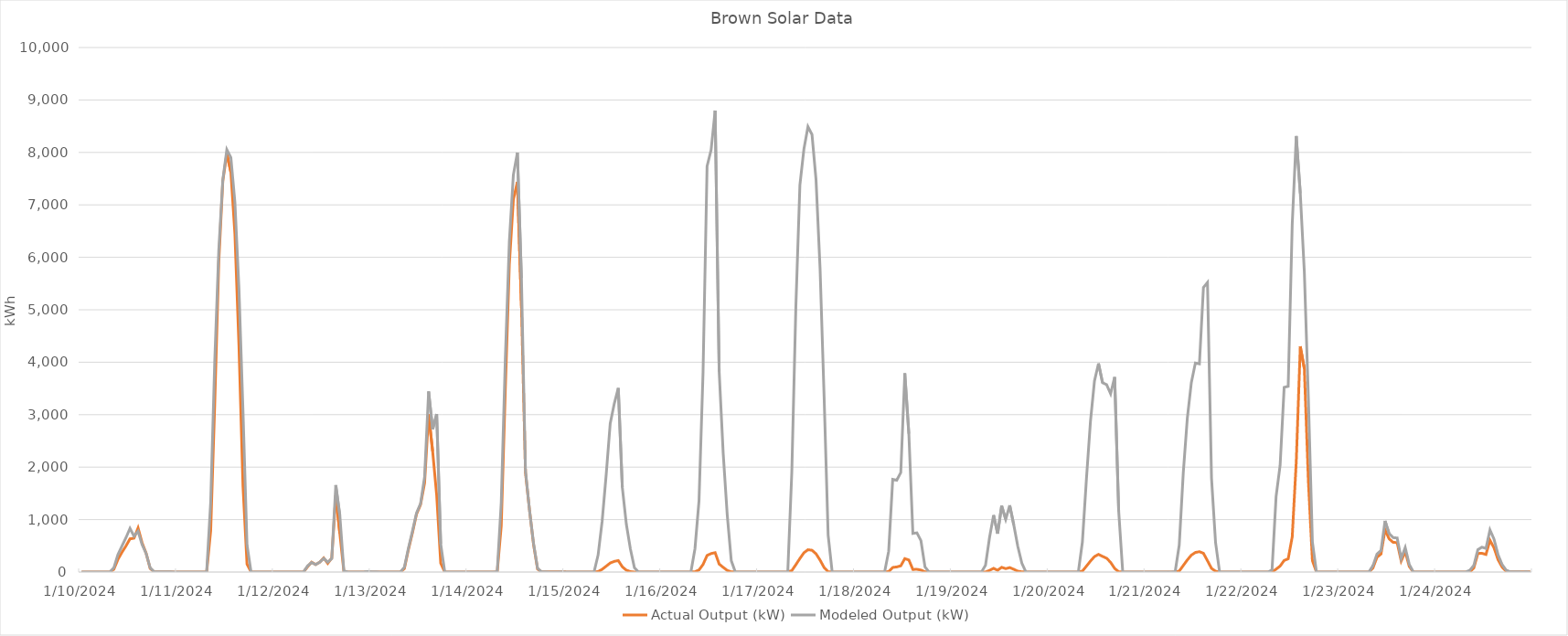
| Category | Actual Output (kW) | Modeled Output (kW) |
|---|---|---|
| 1/10/24 | 1.117 | 1.117 |
| 1/10/24 | 1.09 | 1.09 |
| 1/10/24 | 1.063 | 1.063 |
| 1/10/24 | 1.036 | 1.036 |
| 1/10/24 | 1.009 | 1.009 |
| 1/10/24 | 0.982 | 0.982 |
| 1/10/24 | 0.955 | 0.955 |
| 1/10/24 | 0.928 | 0.928 |
| 1/10/24 | 51.769 | 81.264 |
| 1/10/24 | 237.368 | 328.672 |
| 1/10/24 | 373.502 | 496.039 |
| 1/10/24 | 496.293 | 653.382 |
| 1/10/24 | 632.384 | 832.206 |
| 1/10/24 | 645.488 | 684.64 |
| 1/10/24 | 839.412 | 778.099 |
| 1/10/24 | 557.953 | 524.02 |
| 1/10/24 | 355.719 | 352.922 |
| 1/10/24 | 66.972 | 81.865 |
| 1/10/24 | 2.694 | 2.694 |
| 1/10/24 | 2.578 | 2.578 |
| 1/10/24 | 2.461 | 2.461 |
| 1/10/24 | 2.345 | 2.345 |
| 1/10/24 | 2.228 | 2.228 |
| 1/10/24 | 2.112 | 2.112 |
| 1/11/24 | 1.996 | 1.996 |
| 1/11/24 | 1.879 | 1.879 |
| 1/11/24 | 1.763 | 1.763 |
| 1/11/24 | 1.646 | 1.646 |
| 1/11/24 | 1.53 | 1.53 |
| 1/11/24 | 1.413 | 1.413 |
| 1/11/24 | 1.297 | 1.297 |
| 1/11/24 | 3.145 | 2.201 |
| 1/11/24 | 789.109 | 1336.099 |
| 1/11/24 | 3197.18 | 4009.771 |
| 1/11/24 | 5903.223 | 6131.303 |
| 1/11/24 | 7453.196 | 7477.424 |
| 1/11/24 | 7979.953 | 8054.438 |
| 1/11/24 | 7621.726 | 7903.486 |
| 1/11/24 | 6444.588 | 7047.981 |
| 1/11/24 | 4318.28 | 5406.942 |
| 1/11/24 | 1637.657 | 3072.164 |
| 1/11/24 | 151.223 | 519.311 |
| 1/11/24 | 1.551 | 1.551 |
| 1/11/24 | 1.484 | 1.484 |
| 1/11/24 | 1.417 | 1.417 |
| 1/11/24 | 1.349 | 1.349 |
| 1/11/24 | 1.282 | 1.282 |
| 1/11/24 | 1.215 | 1.215 |
| 1/12/24 | 1.148 | 1.148 |
| 1/12/24 | 1.081 | 1.081 |
| 1/12/24 | 1.014 | 1.014 |
| 1/12/24 | 0.947 | 0.947 |
| 1/12/24 | 0.879 | 0.879 |
| 1/12/24 | 0.812 | 0.812 |
| 1/12/24 | 0.745 | 0.745 |
| 1/12/24 | 0.751 | 0.751 |
| 1/12/24 | 99.489 | 115.597 |
| 1/12/24 | 187.894 | 181.935 |
| 1/12/24 | 141.531 | 143.139 |
| 1/12/24 | 185.418 | 187.278 |
| 1/12/24 | 267.803 | 258.576 |
| 1/12/24 | 164.709 | 188.502 |
| 1/12/24 | 266.594 | 256.698 |
| 1/12/24 | 1463.703 | 1658.074 |
| 1/12/24 | 736.057 | 1080.629 |
| 1/12/24 | 11.817 | 22.408 |
| 1/12/24 | 1.42 | 1.42 |
| 1/12/24 | 1.331 | 1.331 |
| 1/12/24 | 1.241 | 1.241 |
| 1/12/24 | 1.152 | 1.152 |
| 1/12/24 | 1.063 | 2.999 |
| 1/12/24 | 0.974 | 6.732 |
| 1/13/24 | 0.884 | 2.244 |
| 1/13/24 | 0.795 | 3.715 |
| 1/13/24 | 0.706 | 1.595 |
| 1/13/24 | 0.617 | 0.303 |
| 1/13/24 | 0.527 | 0.743 |
| 1/13/24 | 0.438 | 0.438 |
| 1/13/24 | 0.349 | 0.349 |
| 1/13/24 | 0.293 | 0.132 |
| 1/13/24 | 68.04 | 93.998 |
| 1/13/24 | 430.234 | 457.523 |
| 1/13/24 | 748.734 | 782.355 |
| 1/13/24 | 1101.31 | 1125.167 |
| 1/13/24 | 1283.855 | 1304.01 |
| 1/13/24 | 1699.188 | 1813.805 |
| 1/13/24 | 3004.897 | 3442.887 |
| 1/13/24 | 2300.74 | 2720.902 |
| 1/13/24 | 1461.256 | 3012.336 |
| 1/13/24 | 167.529 | 534.087 |
| 1/13/24 | 0.818 | 0.818 |
| 1/13/24 | 0.785 | 0.785 |
| 1/13/24 | 0.779 | 0.779 |
| 1/13/24 | 0.772 | 0.772 |
| 1/13/24 | 0.766 | 0.766 |
| 1/13/24 | 0.759 | 0.759 |
| 1/14/24 | 0.753 | 0.753 |
| 1/14/24 | 0.746 | 0.746 |
| 1/14/24 | 0.74 | 0.74 |
| 1/14/24 | 0.733 | 0.157 |
| 1/14/24 | 0.727 | 0.213 |
| 1/14/24 | 0.72 | 0.72 |
| 1/14/24 | 0.714 | 0.038 |
| 1/14/24 | 3.613 | 9.385 |
| 1/14/24 | 881.484 | 1331.868 |
| 1/14/24 | 3462.047 | 4049.431 |
| 1/14/24 | 5860.354 | 6302.619 |
| 1/14/24 | 7101.14 | 7569.178 |
| 1/14/24 | 7438.444 | 7996.564 |
| 1/14/24 | 5077.052 | 5603.112 |
| 1/14/24 | 1895.416 | 1934.591 |
| 1/14/24 | 1181.339 | 1177.521 |
| 1/14/24 | 525.625 | 549.438 |
| 1/14/24 | 56.055 | 71.303 |
| 1/14/24 | 2.631 | 2.631 |
| 1/14/24 | 2.551 | 2.551 |
| 1/14/24 | 2.471 | 0.049 |
| 1/14/24 | 2.391 | 0.007 |
| 1/14/24 | 2.311 | 0.046 |
| 1/14/24 | 2.231 | 2.231 |
| 1/15/24 | 2.151 | 2.151 |
| 1/15/24 | 2.07 | 2.07 |
| 1/15/24 | 1.99 | 1.99 |
| 1/15/24 | 1.91 | 1.91 |
| 1/15/24 | 1.83 | 1.83 |
| 1/15/24 | 1.75 | 1.75 |
| 1/15/24 | 1.67 | 1.67 |
| 1/15/24 | 1.59 | 3.405 |
| 1/15/24 | 9.137 | 324.84 |
| 1/15/24 | 51.545 | 967.415 |
| 1/15/24 | 111.53 | 1855.408 |
| 1/15/24 | 172.12 | 2833.085 |
| 1/15/24 | 202.746 | 3208.798 |
| 1/15/24 | 218.692 | 3507.452 |
| 1/15/24 | 99.538 | 1613.069 |
| 1/15/24 | 35.231 | 909.422 |
| 1/15/24 | 8.24 | 440.327 |
| 1/15/24 | 0.205 | 83.37 |
| 1/15/24 | 0.331 | 0 |
| 1/15/24 | 0.47 | 0.47 |
| 1/15/24 | 0.61 | 0.61 |
| 1/15/24 | 0.75 | 0.75 |
| 1/15/24 | 0.889 | 0.889 |
| 1/15/24 | 1.029 | 1.029 |
| 1/16/24 | 1.169 | 1.169 |
| 1/16/24 | 1.309 | 1.309 |
| 1/16/24 | 1.448 | 1.448 |
| 1/16/24 | 1.588 | 1.588 |
| 1/16/24 | 1.728 | 1.728 |
| 1/16/24 | 1.867 | 1.867 |
| 1/16/24 | 2.007 | 2.007 |
| 1/16/24 | 2.147 | 4.236 |
| 1/16/24 | 5.799 | 444.506 |
| 1/16/24 | 39.382 | 1355.32 |
| 1/16/24 | 143.743 | 3797.621 |
| 1/16/24 | 315.302 | 7737.368 |
| 1/16/24 | 352.355 | 8047.846 |
| 1/16/24 | 369.279 | 8797.655 |
| 1/16/24 | 151.517 | 3818.284 |
| 1/16/24 | 89.368 | 2257.723 |
| 1/16/24 | 30.292 | 1087.942 |
| 1/16/24 | 3.247 | 216.317 |
| 1/16/24 | 1.899 | 1.899 |
| 1/16/24 | 1.819 | 1.819 |
| 1/16/24 | 1.74 | 1.74 |
| 1/16/24 | 1.66 | 1.66 |
| 1/16/24 | 1.581 | 1.581 |
| 1/16/24 | 1.502 | 1.502 |
| 1/17/24 | 1.422 | 1.422 |
| 1/17/24 | 1.343 | 1.343 |
| 1/17/24 | 1.264 | 1.264 |
| 1/17/24 | 1.184 | 1.184 |
| 1/17/24 | 1.105 | 1.105 |
| 1/17/24 | 1.026 | 1.026 |
| 1/17/24 | 0.946 | 0.946 |
| 1/17/24 | 0.867 | 6.094 |
| 1/17/24 | 26.657 | 1907.341 |
| 1/17/24 | 139.91 | 5058.198 |
| 1/17/24 | 258.146 | 7375.415 |
| 1/17/24 | 367.362 | 8064.539 |
| 1/17/24 | 425.321 | 8489.789 |
| 1/17/24 | 415.497 | 8341.32 |
| 1/17/24 | 347.248 | 7481.351 |
| 1/17/24 | 227.566 | 5785.934 |
| 1/17/24 | 86.258 | 3346.729 |
| 1/17/24 | 5.177 | 704.229 |
| 1/17/24 | 0.434 | 0.434 |
| 1/17/24 | 0.467 | 0.467 |
| 1/17/24 | 0.501 | 0.501 |
| 1/17/24 | 0.535 | 0.535 |
| 1/17/24 | 0.569 | 0.569 |
| 1/17/24 | 0.602 | 0.602 |
| 1/18/24 | 0.636 | 0.636 |
| 1/18/24 | 0.67 | 0.67 |
| 1/18/24 | 0.703 | 0.703 |
| 1/18/24 | 0.737 | 0.737 |
| 1/18/24 | 0.771 | 0.771 |
| 1/18/24 | 0.805 | 0.805 |
| 1/18/24 | 0.838 | 0.838 |
| 1/18/24 | 0.872 | 2.914 |
| 1/18/24 | 9.57 | 397.602 |
| 1/18/24 | 87.454 | 1765.392 |
| 1/18/24 | 97.136 | 1750.847 |
| 1/18/24 | 118.116 | 1895.493 |
| 1/18/24 | 255.877 | 3789.155 |
| 1/18/24 | 230.538 | 2636.073 |
| 1/18/24 | 48.828 | 734.975 |
| 1/18/24 | 51.705 | 748.375 |
| 1/18/24 | 37.565 | 597.911 |
| 1/18/24 | 3.988 | 96.769 |
| 1/18/24 | 1.587 | 0 |
| 1/18/24 | 1.506 | 0 |
| 1/18/24 | 1.426 | 0 |
| 1/18/24 | 1.346 | 0 |
| 1/18/24 | 1.266 | 0 |
| 1/18/24 | 1.185 | 0 |
| 1/19/24 | 1.105 | 0 |
| 1/19/24 | 1.025 | 0.026 |
| 1/19/24 | 0.944 | 0 |
| 1/19/24 | 0.864 | 0 |
| 1/19/24 | 0.784 | 0 |
| 1/19/24 | 0.704 | 0.704 |
| 1/19/24 | 0.623 | 0 |
| 1/19/24 | 0.543 | 0.679 |
| 1/19/24 | 0.753 | 129.74 |
| 1/19/24 | 31.23 | 663.083 |
| 1/19/24 | 70.562 | 1085.532 |
| 1/19/24 | 33.625 | 731.275 |
| 1/19/24 | 90.473 | 1262.226 |
| 1/19/24 | 64.387 | 1004.159 |
| 1/19/24 | 84.93 | 1272.962 |
| 1/19/24 | 52.155 | 899.693 |
| 1/19/24 | 16.243 | 487.287 |
| 1/19/24 | 4.729 | 167.74 |
| 1/19/24 | 1.741 | 1.741 |
| 1/19/24 | 1.71 | 1.71 |
| 1/19/24 | 1.678 | 1.678 |
| 1/19/24 | 1.647 | 1.647 |
| 1/19/24 | 1.616 | 1.616 |
| 1/19/24 | 1.585 | 1.585 |
| 1/20/24 | 1.554 | 1.554 |
| 1/20/24 | 1.523 | 1.523 |
| 1/20/24 | 1.492 | 1.492 |
| 1/20/24 | 1.461 | 1.461 |
| 1/20/24 | 1.43 | 1.43 |
| 1/20/24 | 1.399 | 1.399 |
| 1/20/24 | 1.368 | 1.368 |
| 1/20/24 | 1.337 | 1.337 |
| 1/20/24 | 17.552 | 570.808 |
| 1/20/24 | 111.943 | 1769.822 |
| 1/20/24 | 208.623 | 2867.287 |
| 1/20/24 | 294.492 | 3644.688 |
| 1/20/24 | 336.9 | 3976.483 |
| 1/20/24 | 298.464 | 3608.837 |
| 1/20/24 | 263.067 | 3573.649 |
| 1/20/24 | 184.443 | 3399.059 |
| 1/20/24 | 68.018 | 3717.806 |
| 1/20/24 | 5.431 | 1159.902 |
| 1/20/24 | 1.057 | 1.057 |
| 1/20/24 | 1.126 | 1.126 |
| 1/20/24 | 1.195 | 1.195 |
| 1/20/24 | 1.263 | 1.263 |
| 1/20/24 | 1.332 | 1.332 |
| 1/20/24 | 1.401 | 1.401 |
| 1/21/24 | 1.47 | 1.47 |
| 1/21/24 | 1.538 | 1.538 |
| 1/21/24 | 1.607 | 1.607 |
| 1/21/24 | 1.677 | 1.677 |
| 1/21/24 | 1.745 | 1.745 |
| 1/21/24 | 1.813 | 1.813 |
| 1/21/24 | 1.882 | 1.882 |
| 1/21/24 | 1.951 | 8.203 |
| 1/21/24 | 18.791 | 512.191 |
| 1/21/24 | 124.085 | 1889.016 |
| 1/21/24 | 230.071 | 2929.474 |
| 1/21/24 | 321.636 | 3611.899 |
| 1/21/24 | 373.065 | 3985.724 |
| 1/21/24 | 388.024 | 3968.036 |
| 1/21/24 | 357.416 | 5424.774 |
| 1/21/24 | 215.267 | 5520.417 |
| 1/21/24 | 69.293 | 1788.692 |
| 1/21/24 | 15.532 | 564.369 |
| 1/21/24 | 1.926 | 1.926 |
| 1/21/24 | 1.835 | 1.835 |
| 1/21/24 | 1.744 | 1.744 |
| 1/21/24 | 1.653 | 1.653 |
| 1/21/24 | 1.562 | 1.562 |
| 1/21/24 | 1.471 | 1.471 |
| 1/22/24 | 1.38 | 1.38 |
| 1/22/24 | 1.289 | 1.289 |
| 1/22/24 | 1.198 | 1.198 |
| 1/22/24 | 1.107 | 1.107 |
| 1/22/24 | 1.016 | 1.016 |
| 1/22/24 | 0.925 | 0.925 |
| 1/22/24 | 0.834 | 0.834 |
| 1/22/24 | 1.045 | 42.253 |
| 1/22/24 | 54.398 | 1439.215 |
| 1/22/24 | 113.962 | 2034.367 |
| 1/22/24 | 220.681 | 3522.017 |
| 1/22/24 | 252.254 | 3541.624 |
| 1/22/24 | 670.514 | 6628.081 |
| 1/22/24 | 2107.961 | 8311.377 |
| 1/22/24 | 4302.111 | 7220.003 |
| 1/22/24 | 3879.806 | 5724.29 |
| 1/22/24 | 1731.368 | 3317.596 |
| 1/22/24 | 216.837 | 570.68 |
| 1/22/24 | 1.13 | 1.13 |
| 1/22/24 | 0.911 | 0.911 |
| 1/22/24 | 0.919 | 0.919 |
| 1/22/24 | 0.927 | 0.927 |
| 1/22/24 | 0.935 | 0.935 |
| 1/22/24 | 0.942 | 0.942 |
| 1/23/24 | 0.95 | 0.95 |
| 1/23/24 | 0.958 | 0.958 |
| 1/23/24 | 0.966 | 0.966 |
| 1/23/24 | 0.974 | 0.974 |
| 1/23/24 | 0.982 | 0.982 |
| 1/23/24 | 0.989 | 0.989 |
| 1/23/24 | 0.997 | 0.997 |
| 1/23/24 | 1.006 | 1.96 |
| 1/23/24 | 77.098 | 119.084 |
| 1/23/24 | 281.016 | 342.189 |
| 1/23/24 | 344.162 | 410.928 |
| 1/23/24 | 807.798 | 975.074 |
| 1/23/24 | 634.057 | 736.373 |
| 1/23/24 | 565.67 | 656.426 |
| 1/23/24 | 561.994 | 649.155 |
| 1/23/24 | 210.459 | 259.127 |
| 1/23/24 | 388.519 | 466.589 |
| 1/23/24 | 106.08 | 146.491 |
| 1/23/24 | 0.613 | 1.743 |
| 1/23/24 | 0.645 | 0.645 |
| 1/23/24 | 0.677 | 0.677 |
| 1/23/24 | 0.709 | 0.709 |
| 1/23/24 | 0.741 | 0.741 |
| 1/23/24 | 0.773 | 0.773 |
| 1/24/24 | 0.804 | 0.804 |
| 1/24/24 | 0.836 | 0.836 |
| 1/24/24 | 0.868 | 0.868 |
| 1/24/24 | 0.9 | 0.9 |
| 1/24/24 | 0.932 | 0.932 |
| 1/24/24 | 0.964 | 0.964 |
| 1/24/24 | 0.996 | 0.996 |
| 1/24/24 | 1.028 | 0.21 |
| 1/24/24 | 2.249 | 34.218 |
| 1/24/24 | 78.493 | 125.818 |
| 1/24/24 | 353.881 | 426.646 |
| 1/24/24 | 357.687 | 474.277 |
| 1/24/24 | 334.229 | 449.145 |
| 1/24/24 | 605.996 | 802.26 |
| 1/24/24 | 461.81 | 627.511 |
| 1/24/24 | 235.484 | 330.611 |
| 1/24/24 | 95.487 | 143.111 |
| 1/24/24 | 15.839 | 37.826 |
| 1/24/24 | 3.114 | 3.114 |
| 1/24/24 | 3.009 | 3.009 |
| 1/24/24 | 2.903 | 2.903 |
| 1/24/24 | 2.798 | 1.596 |
| 1/24/24 | 2.692 | 2.692 |
| 1/24/24 | 2.587 | 1.035 |